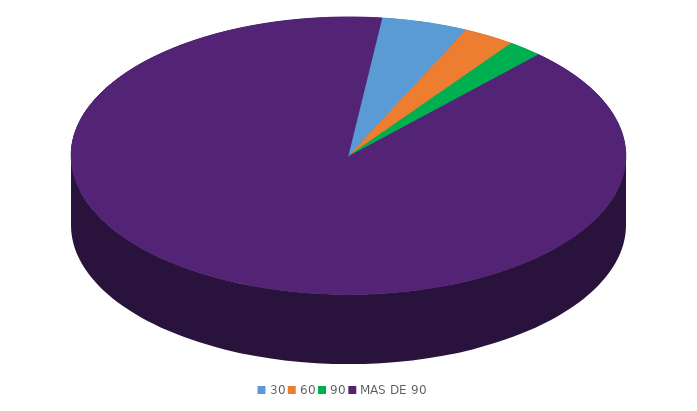
| Category | Series 0 |
|---|---|
| 30 | 1562908.7 |
| 60 | 937745.2 |
| 90 | 625163.5 |
| MAS DE 90 | 28132356.2 |